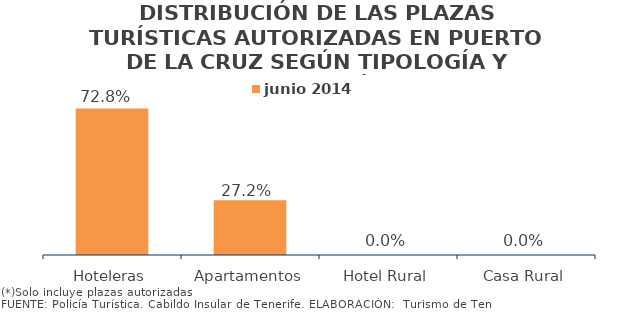
| Category | junio 2014 |
|---|---|
| Hoteleras | 0.728 |
| Apartamentos | 0.272 |
| Hotel Rural | 0 |
| Casa Rural | 0 |